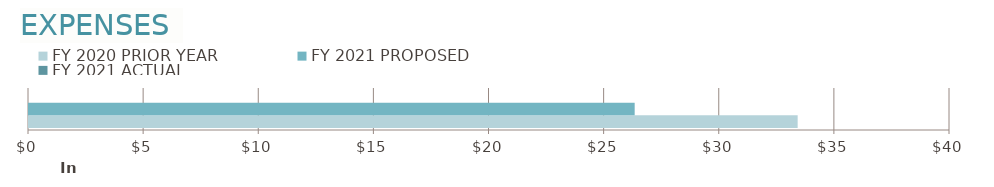
| Category | FY 2020 | FY 2021 |
|---|---|---|
| 0 | 33383.74 | 0 |